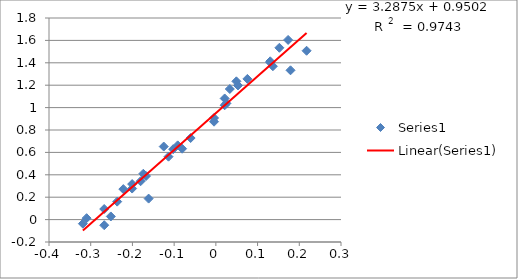
| Category | Series 0 |
|---|---|
| 0.21748394421390627 | 1.508 |
| 0.17897694729316943 | 1.333 |
| 0.1367205671564068 | 1.369 |
| 0.04921802267018165 | 1.234 |
| -0.10237290870955855 | 0.629 |
| -0.2006594505464183 | 0.277 |
| -0.25181197299379954 | 0.028 |
| -0.26760624017703144 | -0.05 |
| -0.16115090926274472 | 0.188 |
| 0.13033376849500614 | 1.403 |
| 0.15228834438305647 | 1.534 |
| 0.05307844348341968 | 1.198 |
| 0.02530586526477026 | 1.038 |
| 0.07554696139253074 | 1.256 |
| 0.021189299069938092 | 1.021 |
| -0.004364805402450088 | 0.907 |
| -0.09151498112135022 | 0.663 |
| -0.2218487496163564 | 0.272 |
| -0.23657200643706275 | 0.16 |
| -0.16749108729376366 | 0.389 |
| -0.11350927482751812 | 0.562 |
| -0.1804560644581313 | 0.342 |
| -0.3098039199714863 | 0.013 |
| -0.3187587626244128 | -0.036 |
| 0.021189299069938092 | 1.082 |
| 0.13033376849500614 | 1.413 |
| 0.03342375548694973 | 1.166 |
| 0.17318626841227402 | 1.604 |
| -0.004364805402450088 | 0.874 |
| -0.060480747381381476 | 0.728 |
| -0.08092190762392612 | 0.633 |
| -0.12493873660829995 | 0.652 |
| -0.17392519729917355 | 0.409 |
| -0.2006594505464183 | 0.317 |
| -0.26760624017703144 | 0.094 |